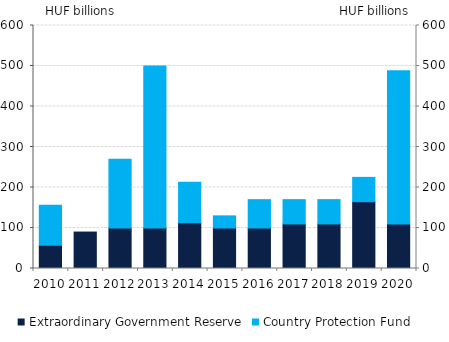
| Category | Extraordinary Government Reserve | Country Protection Fund |
|---|---|---|
| 2010.0 | 57.278 | 98.6 |
| 2011.0 | 90 | 0 |
| 2012.0 | 100 | 170 |
| 2013.0 | 100 | 400 |
| 2014.0 | 113 | 100 |
| 2015.0 | 100 | 30 |
| 2016.0 | 100 | 70 |
| 2017.0 | 110 | 60 |
| 2018.0 | 110 | 60 |
| 2019.0 | 165 | 60 |
| 2020.0 | 110 | 378 |